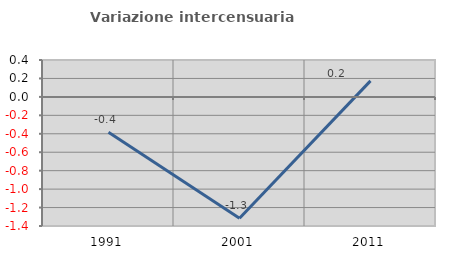
| Category | Variazione intercensuaria annua |
|---|---|
| 1991.0 | -0.383 |
| 2001.0 | -1.317 |
| 2011.0 | 0.173 |